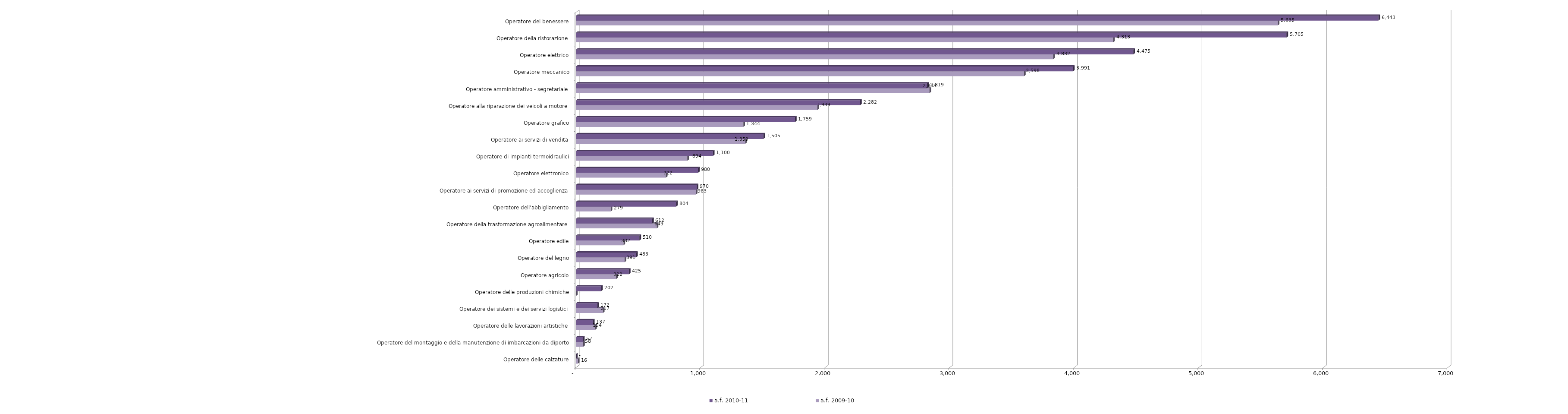
| Category | a.f. 2010-11 | a.f. 2009-10 |
|---|---|---|
| Operatore del benessere | 6443 | 5635 |
| Operatore della ristorazione | 5705 | 4313 |
| Operatore elettrico | 4475 | 3832 |
| Operatore meccanico | 3991 | 3598 |
| Operatore amministrativo - segretariale | 2819 | 2839 |
| Operatore alla riparazione dei veicoli a motore | 2282 | 1939 |
| Operatore grafico | 1759 | 1344 |
| Operatore ai servizi di vendita | 1505 | 1359 |
| Operatore di impianti termoidraulici | 1100 | 894 |
| Operatore elettronico | 980 | 722 |
| Operatore ai servizi di promozione ed accoglienza | 970 | 963 |
| Operatore dell’abbigliamento | 804 | 279 |
| Operatore della trasformazione agroalimentare | 612 | 649 |
| Operatore edile | 510 | 382 |
| Operatore del legno | 483 | 391 |
| Operatore agricolo | 425 | 322 |
| Operatore delle produzioni chimiche | 202 | 0 |
| Operatore dei sistemi e dei servizi logistici | 172 | 217 |
| Operatore delle lavorazioni artistiche | 137 | 154 |
| Operatore del montaggio e della manutenzione di imbarcazioni da diporto | 57 | 58 |
| Operatore delle calzature | 0 | 16 |